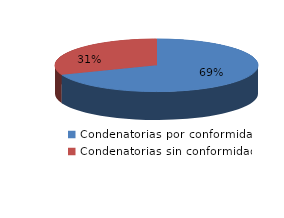
| Category | Series 0 |
|---|---|
| 0 | 909 |
| 1 | 406 |